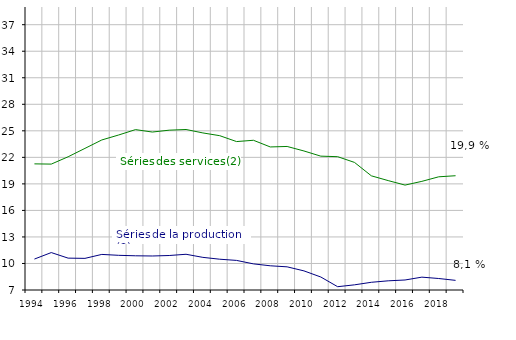
| Category | Term STI, Agri, STL | Term STG, SMS, TMD, STHR |
|---|---|---|
| 1994.0 | 10.499 | 21.263 |
| 1995.0 | 11.233 | 21.236 |
| 1996.0 | 10.603 | 22.064 |
| 1997.0 | 10.577 | 23.013 |
| 1998.0 | 11.024 | 23.966 |
| 1999.0 | 10.921 | 24.527 |
| 2000.0 | 10.869 | 25.136 |
| 2001.0 | 10.845 | 24.861 |
| 2002.0 | 10.9 | 25.071 |
| 2003.0 | 11.04 | 25.149 |
| 2004.0 | 10.689 | 24.761 |
| 2005.0 | 10.482 | 24.451 |
| 2006.0 | 10.345 | 23.784 |
| 2007.0 | 9.955 | 23.93 |
| 2008.0 | 9.738 | 23.175 |
| 2009.0 | 9.62 | 23.23 |
| 2010.0 | 9.162 | 22.721 |
| 2011.0 | 8.469 | 22.136 |
| 2012.0 | 7.374 | 22.076 |
| 2013.0 | 7.584 | 21.426 |
| 2014.0 | 7.873 | 19.911 |
| 2015.0 | 8.037 | 19.371 |
| 2016.0 | 8.132 | 18.864 |
| 2017.0 | 8.454 | 19.286 |
| 2018.0 | 8.3 | 19.8 |
| 2019.0 | 8.089 | 19.922 |